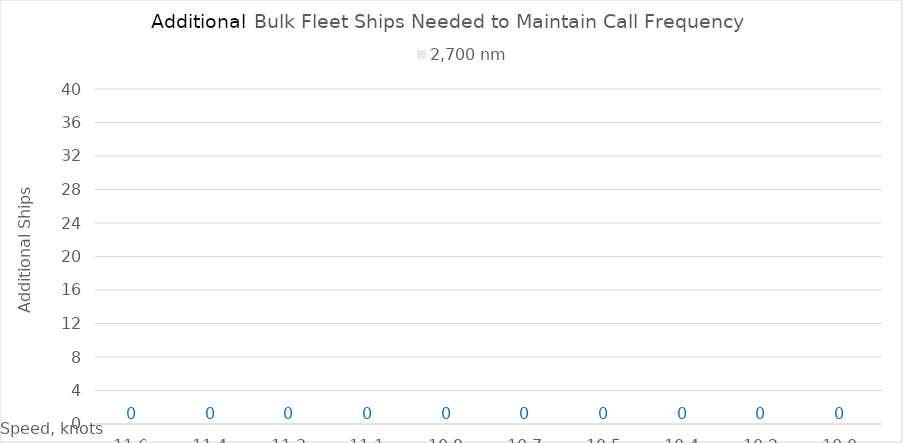
| Category | 2,700 |
|---|---|
| 11.620000000000001 | 0 |
| 11.440000000000001 | 0 |
| 11.260000000000002 | 0 |
| 11.080000000000002 | 0 |
| 10.900000000000002 | 0 |
| 10.720000000000002 | 0 |
| 10.540000000000003 | 0 |
| 10.360000000000003 | 0 |
| 10.180000000000003 | 0 |
| 10.000000000000004 | 0 |